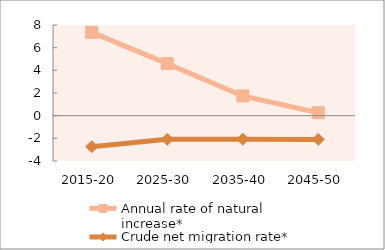
| Category | Annual rate of natural increase* | Crude net migration rate* |
|---|---|---|
| 2015-20 | 7.352 | -2.739 |
| 2025-30 | 4.595 | -2.09 |
| 2035-40 | 1.741 | -2.07 |
| 2045-50 | 0.262 | -2.092 |